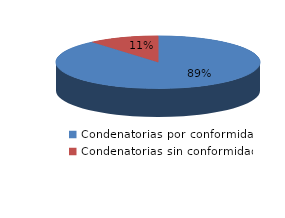
| Category | Series 0 |
|---|---|
| 0 | 8 |
| 1 | 1 |